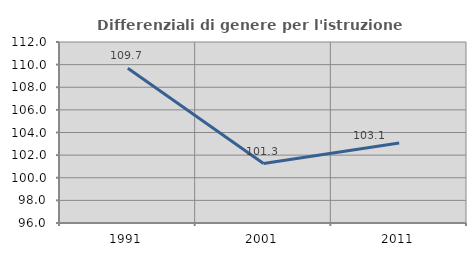
| Category | Differenziali di genere per l'istruzione superiore |
|---|---|
| 1991.0 | 109.672 |
| 2001.0 | 101.254 |
| 2011.0 | 103.072 |